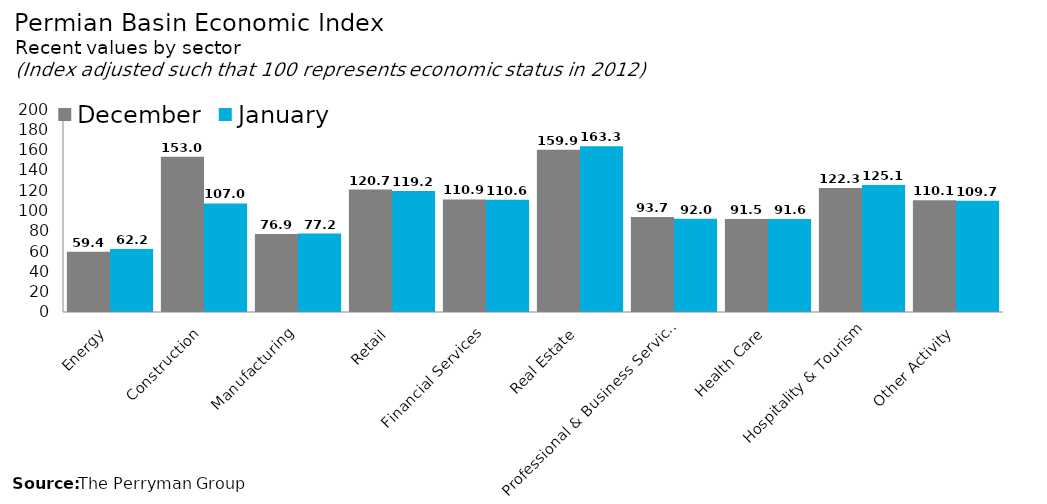
| Category | December | January |
|---|---|---|
| Energy | 59.434 | 62.154 |
| Construction | 153.009 | 107.006 |
| Manufacturing | 76.933 | 77.237 |
| Retail | 120.677 | 119.168 |
| Financial Services | 110.947 | 110.567 |
| Real Estate | 159.948 | 163.323 |
| Professional & Business Services | 93.656 | 91.957 |
| Health Care | 91.537 | 91.599 |
| Hospitality & Tourism | 122.251 | 125.091 |
| Other Activity | 110.086 | 109.696 |